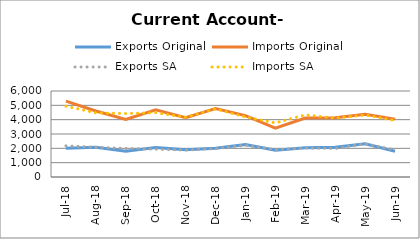
| Category | Exports Original | Imports Original | Exports SA | Imports SA |
|---|---|---|---|---|
| 2018-07-11 | 2013 | 5290 | 2174 | 4939 |
| 2018-08-11 | 2075 | 4606 | 2074 | 4476 |
| 2018-09-11 | 1805 | 4008 | 1989 | 4427 |
| 2018-10-11 | 2061 | 4680 | 1945 | 4486 |
| 2018-11-11 | 1898 | 4142 | 1878 | 4169 |
| 2018-12-11 | 2013 | 4776 | 1984 | 4752 |
| 2019-01-11 | 2274 | 4285 | 2217 | 4188 |
| 2019-02-11 | 1875 | 3407 | 1912 | 3773 |
| 2019-03-11 | 2037 | 4118 | 2021 | 4336 |
| 2019-04-11 | 2084 | 4135 | 1987 | 4104 |
| 2019-05-11 | 2323 | 4384 | 2315 | 4328 |
| 2019-06-11 | 1799 | 4038 | 1890 | 3940 |